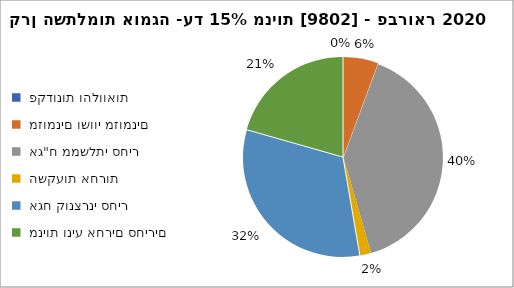
| Category | קרן השתלמות אומגה -עד 15% מניות [9802] - פברואר 2020 |
|---|---|
|  פקדונות והלוואות  | 0 |
|  מזומנים ושווי מזומנים   | 1981 |
|  אג"ח ממשלתי סחיר  | 14003 |
|  השקעות אחרות  | 613 |
|  אגח קונצרני סחיר  | 11281 |
|  מניות וניע אחרים סחירים   | 7219 |